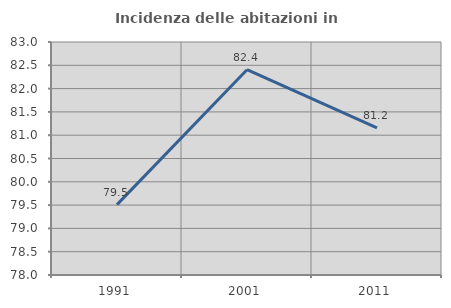
| Category | Incidenza delle abitazioni in proprietà  |
|---|---|
| 1991.0 | 79.511 |
| 2001.0 | 82.406 |
| 2011.0 | 81.156 |